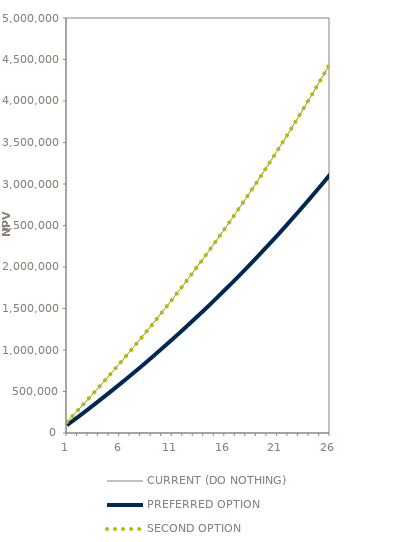
| Category | CURRENT (DO NOTHING) | PREFERRED OPTION | SECOND OPTION |
|---|---|---|---|
| 1.0 | 133180.824 | 93226.577 | 133180.824 |
| 2.0 | 268757.863 | 188130.504 | 268757.863 |
| 3.0 | 406800.891 | 284760.624 | 406800.891 |
| 4.0 | 547381.196 | 383166.837 | 547381.196 |
| 5.0 | 690571.616 | 483400.131 | 690571.616 |
| 6.0 | 836446.582 | 585512.607 | 836446.582 |
| 7.0 | 985082.158 | 689557.51 | 985082.158 |
| 8.0 | 1136556.082 | 795589.258 | 1136556.082 |
| 9.0 | 1290947.811 | 903663.468 | 1290947.811 |
| 10.0 | 1448338.562 | 1013836.994 | 1448338.562 |
| 11.0 | 1608811.359 | 1126167.951 | 1608811.359 |
| 12.0 | 1772451.075 | 1240715.753 | 1772451.075 |
| 13.0 | 1939344.487 | 1357541.141 | 1939344.487 |
| 14.0 | 2109580.316 | 1476706.221 | 2109580.316 |
| 15.0 | 2283249.279 | 1598274.495 | 2283249.279 |
| 16.0 | 2460444.14 | 1722310.898 | 2460444.14 |
| 17.0 | 2641259.762 | 1848881.833 | 2641259.762 |
| 18.0 | 2825793.158 | 1978055.211 | 2825793.158 |
| 19.0 | 3014143.546 | 2109900.482 | 3014143.546 |
| 20.0 | 3206412.405 | 2244488.683 | 3206412.405 |
| 21.0 | 3402703.528 | 2381892.469 | 3402703.528 |
| 22.0 | 3603123.085 | 2522186.16 | 3603123.085 |
| 23.0 | 3807779.68 | 2665445.776 | 3807779.68 |
| 24.0 | 4016784.41 | 2811749.087 | 4016784.41 |
| 25.0 | 4230250.93 | 2961175.651 | 4230250.93 |
| 26.0 | 4448295.514 | 3113806.86 | 4448295.514 |